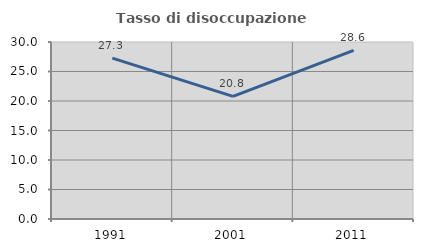
| Category | Tasso di disoccupazione giovanile  |
|---|---|
| 1991.0 | 27.273 |
| 2001.0 | 20.779 |
| 2011.0 | 28.571 |